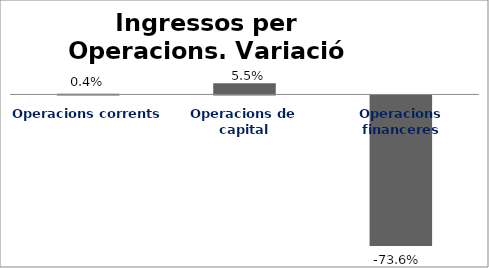
| Category | Series 0 |
|---|---|
| Operacions corrents | 0.004 |
| Operacions de capital | 0.055 |
| Operacions financeres | -0.736 |